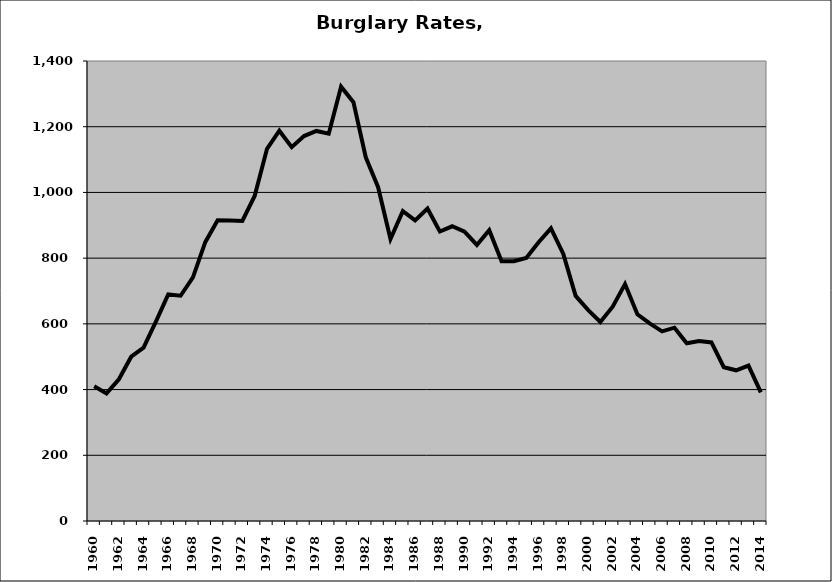
| Category | Burglary |
|---|---|
| 1960.0 | 410.385 |
| 1961.0 | 388.428 |
| 1962.0 | 431.231 |
| 1963.0 | 500.102 |
| 1964.0 | 527.52 |
| 1965.0 | 606.869 |
| 1966.0 | 689.683 |
| 1967.0 | 685.547 |
| 1968.0 | 741.296 |
| 1969.0 | 848.517 |
| 1970.0 | 914.967 |
| 1971.0 | 914.741 |
| 1972.0 | 913.233 |
| 1973.0 | 989.283 |
| 1974.0 | 1132.907 |
| 1975.0 | 1187.811 |
| 1976.0 | 1137.866 |
| 1977.0 | 1171.609 |
| 1978.0 | 1187.146 |
| 1979.0 | 1178.859 |
| 1980.0 | 1321.904 |
| 1981.0 | 1274.802 |
| 1982.0 | 1106.95 |
| 1983.0 | 1015.812 |
| 1984.0 | 858.111 |
| 1985.0 | 942.918 |
| 1986.0 | 914.895 |
| 1987.0 | 950.893 |
| 1988.0 | 881.017 |
| 1989.0 | 896.954 |
| 1990.0 | 880.634 |
| 1991.0 | 840.226 |
| 1992.0 | 884.997 |
| 1993.0 | 790.753 |
| 1994.0 | 790.828 |
| 1995.0 | 800.769 |
| 1996.0 | 848.25 |
| 1997.0 | 890.481 |
| 1998.0 | 812.857 |
| 1999.0 | 685.123 |
| 2000.0 | 642.495 |
| 2001.0 | 605.781 |
| 2002.0 | 652.237 |
| 2003.0 | 721.094 |
| 2004.0 | 628.948 |
| 2005.0 | 601.164 |
| 2006.0 | 577.162 |
| 2007.0 | 588.358 |
| 2008.0 | 540.966 |
| 2009.0 | 547.948 |
| 2010.0 | 543.329 |
| 2011.0 | 467.959 |
| 2012.0 | 458.69 |
| 2013.0 | 472.89 |
| 2014.0 | 391.382 |